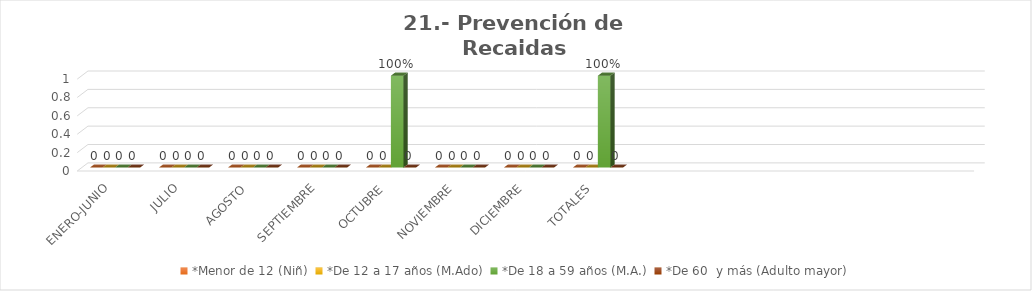
| Category | *Menor de 12 (Niñ) | *De 12 a 17 años (M.Ado) | *De 18 a 59 años (M.A.) | *De 60  y más (Adulto mayor) |
|---|---|---|---|---|
| ENERO-JUNIO | 0 | 0 | 0 | 0 |
| JULIO | 0 | 0 | 0 | 0 |
| AGOSTO | 0 | 0 | 0 | 0 |
| SEPTIEMBRE | 0 | 0 | 0 | 0 |
| OCTUBRE | 0 | 0 | 1 | 0 |
| NOVIEMBRE | 0 | 0 | 0 | 0 |
| DICIEMBRE | 0 | 0 | 0 | 0 |
| TOTALES | 0 | 0 | 1 | 0 |